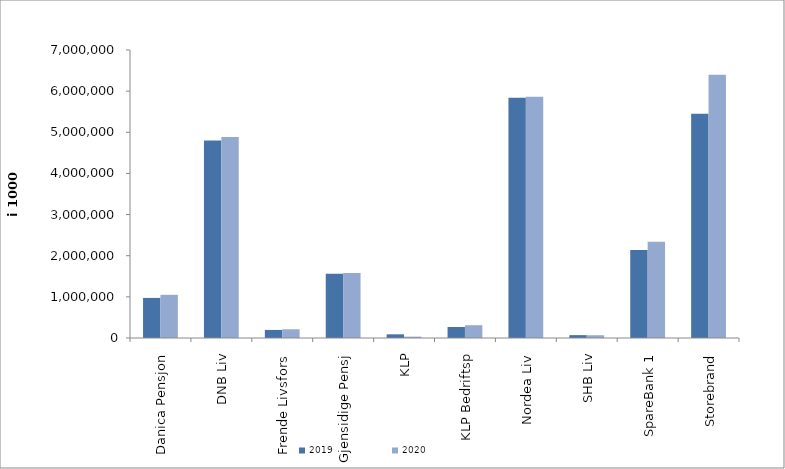
| Category | 2019 | 2020 |
|---|---|---|
| Danica Pensjon | 974428.506 | 1049553.103 |
| DNB Liv | 4802393.843 | 4882926.419 |
| Frende Livsfors | 196043 | 211959 |
| Gjensidige Pensj | 1561713.2 | 1579911 |
| KLP | 89130.341 | 32970.711 |
| KLP Bedriftsp | 267105 | 310599 |
| Nordea Liv | 5841396.803 | 5863550.965 |
| SHB Liv | 69806.938 | 67197.384 |
| SpareBank 1 | 2141160.639 | 2338484.372 |
| Storebrand | 5450501.313 | 6396691.746 |